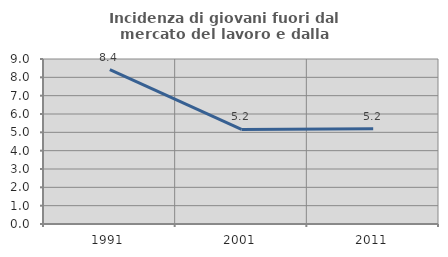
| Category | Incidenza di giovani fuori dal mercato del lavoro e dalla formazione  |
|---|---|
| 1991.0 | 8.426 |
| 2001.0 | 5.157 |
| 2011.0 | 5.191 |